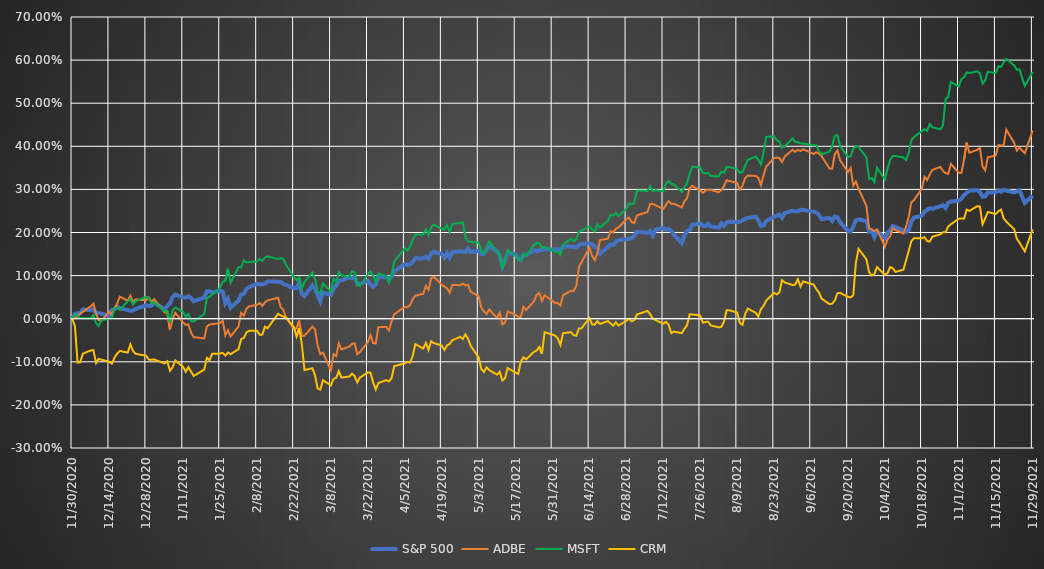
| Category | S&P 500 | ADBE | MSFT | CRM |
|---|---|---|---|---|
| 11/29/21 | 0.285 | 0.437 | 0.573 | 0.207 |
| 11/26/21 | 0.269 | 0.384 | 0.54 | 0.156 |
| 11/24/21 | 0.298 | 0.397 | 0.579 | 0.176 |
| 11/23/21 | 0.295 | 0.39 | 0.577 | 0.186 |
| 11/22/21 | 0.293 | 0.408 | 0.587 | 0.208 |
| 11/19/21 | 0.297 | 0.439 | 0.603 | 0.225 |
| 11/18/21 | 0.299 | 0.402 | 0.594 | 0.233 |
| 11/17/21 | 0.295 | 0.402 | 0.584 | 0.253 |
| 11/16/21 | 0.298 | 0.402 | 0.586 | 0.249 |
| 11/15/21 | 0.293 | 0.379 | 0.57 | 0.243 |
| 11/12/21 | 0.293 | 0.374 | 0.573 | 0.248 |
| 11/11/21 | 0.284 | 0.344 | 0.553 | 0.233 |
| 11/10/21 | 0.283 | 0.353 | 0.545 | 0.219 |
| 11/9/21 | 0.294 | 0.396 | 0.569 | 0.26 |
| 11/8/21 | 0.298 | 0.392 | 0.574 | 0.261 |
| 11/5/21 | 0.297 | 0.385 | 0.57 | 0.25 |
| 11/4/21 | 0.292 | 0.409 | 0.572 | 0.253 |
| 11/3/21 | 0.287 | 0.369 | 0.56 | 0.232 |
| 11/2/21 | 0.279 | 0.338 | 0.556 | 0.233 |
| 11/1/21 | 0.274 | 0.338 | 0.539 | 0.232 |
| 10/29/21 | 0.272 | 0.359 | 0.549 | 0.219 |
| 10/28/21 | 0.269 | 0.336 | 0.515 | 0.214 |
| 10/27/21 | 0.257 | 0.338 | 0.51 | 0.201 |
| 10/26/21 | 0.263 | 0.343 | 0.449 | 0.201 |
| 10/25/21 | 0.261 | 0.352 | 0.439 | 0.196 |
| 10/22/21 | 0.255 | 0.345 | 0.444 | 0.19 |
| 10/21/21 | 0.256 | 0.335 | 0.452 | 0.179 |
| 10/20/21 | 0.253 | 0.322 | 0.436 | 0.18 |
| 10/19/21 | 0.248 | 0.329 | 0.44 | 0.189 |
| 10/18/21 | 0.239 | 0.302 | 0.435 | 0.187 |
| 10/15/21 | 0.235 | 0.275 | 0.421 | 0.187 |
| 10/14/21 | 0.225 | 0.27 | 0.414 | 0.18 |
| 10/13/21 | 0.205 | 0.235 | 0.384 | 0.157 |
| 10/12/21 | 0.201 | 0.214 | 0.368 | 0.135 |
| 10/11/21 | 0.204 | 0.198 | 0.374 | 0.114 |
| 10/8/21 | 0.213 | 0.206 | 0.377 | 0.109 |
| 10/7/21 | 0.215 | 0.21 | 0.377 | 0.117 |
| 10/6/21 | 0.205 | 0.192 | 0.369 | 0.12 |
| 10/5/21 | 0.2 | 0.184 | 0.349 | 0.106 |
| 10/4/21 | 0.187 | 0.167 | 0.323 | 0.102 |
| 10/1/21 | 0.203 | 0.207 | 0.35 | 0.12 |
| 9/30/21 | 0.189 | 0.203 | 0.317 | 0.103 |
| 9/29/21 | 0.204 | 0.207 | 0.327 | 0.1 |
| 9/28/21 | 0.202 | 0.21 | 0.324 | 0.108 |
| 9/27/21 | 0.227 | 0.262 | 0.374 | 0.138 |
| 9/24/21 | 0.23 | 0.301 | 0.398 | 0.162 |
| 9/23/21 | 0.228 | 0.318 | 0.399 | 0.13 |
| 9/22/21 | 0.214 | 0.309 | 0.395 | 0.054 |
| 9/21/21 | 0.202 | 0.35 | 0.377 | 0.05 |
| 9/20/21 | 0.203 | 0.34 | 0.375 | 0.051 |
| 9/17/21 | 0.224 | 0.368 | 0.401 | 0.06 |
| 9/16/21 | 0.235 | 0.39 | 0.426 | 0.059 |
| 9/15/21 | 0.237 | 0.382 | 0.424 | 0.042 |
| 9/14/21 | 0.227 | 0.348 | 0.4 | 0.035 |
| 9/13/21 | 0.234 | 0.348 | 0.387 | 0.034 |
| 9/10/21 | 0.231 | 0.377 | 0.381 | 0.046 |
| 9/9/21 | 0.241 | 0.383 | 0.389 | 0.061 |
| 9/8/21 | 0.246 | 0.386 | 0.402 | 0.068 |
| 9/7/21 | 0.248 | 0.382 | 0.402 | 0.079 |
| 9/3/21 | 0.252 | 0.393 | 0.407 | 0.087 |
| 9/2/21 | 0.253 | 0.389 | 0.407 | 0.075 |
| 9/1/21 | 0.249 | 0.392 | 0.41 | 0.092 |
| 8/31/21 | 0.249 | 0.387 | 0.41 | 0.079 |
| 8/30/21 | 0.25 | 0.392 | 0.418 | 0.078 |
| 8/27/21 | 0.245 | 0.376 | 0.4 | 0.084 |
| 8/26/21 | 0.234 | 0.363 | 0.397 | 0.089 |
| 8/25/21 | 0.241 | 0.373 | 0.411 | 0.061 |
| 8/24/21 | 0.239 | 0.374 | 0.414 | 0.056 |
| 8/23/21 | 0.237 | 0.373 | 0.423 | 0.06 |
| 8/20/21 | 0.226 | 0.353 | 0.422 | 0.042 |
| 8/19/21 | 0.217 | 0.333 | 0.386 | 0.03 |
| 8/18/21 | 0.215 | 0.31 | 0.358 | 0.022 |
| 8/17/21 | 0.228 | 0.327 | 0.369 | 0.005 |
| 8/16/21 | 0.237 | 0.331 | 0.376 | 0.014 |
| 8/13/21 | 0.234 | 0.332 | 0.368 | 0.023 |
| 8/12/21 | 0.232 | 0.326 | 0.354 | 0.011 |
| 8/11/21 | 0.228 | 0.308 | 0.34 | -0.014 |
| 8/10/21 | 0.225 | 0.299 | 0.338 | -0.01 |
| 8/9/21 | 0.224 | 0.315 | 0.347 | 0.014 |
| 8/6/21 | 0.225 | 0.32 | 0.352 | 0.019 |
| 8/5/21 | 0.223 | 0.321 | 0.352 | 0.019 |
| 8/4/21 | 0.216 | 0.308 | 0.338 | -0.007 |
| 8/3/21 | 0.221 | 0.298 | 0.341 | -0.019 |
| 8/2/21 | 0.211 | 0.293 | 0.33 | -0.02 |
| 7/30/21 | 0.214 | 0.299 | 0.331 | -0.016 |
| 7/29/21 | 0.22 | 0.299 | 0.338 | -0.007 |
| 7/28/21 | 0.215 | 0.298 | 0.337 | -0.007 |
| 7/27/21 | 0.215 | 0.292 | 0.339 | -0.009 |
| 7/26/21 | 0.221 | 0.297 | 0.35 | 0.007 |
| 7/23/21 | 0.218 | 0.308 | 0.353 | 0.01 |
| 7/22/21 | 0.206 | 0.303 | 0.337 | 0.01 |
| 7/21/21 | 0.204 | 0.28 | 0.315 | -0.015 |
| 7/20/21 | 0.194 | 0.272 | 0.305 | -0.023 |
| 7/19/21 | 0.176 | 0.258 | 0.294 | -0.034 |
| 7/16/21 | 0.195 | 0.267 | 0.311 | -0.03 |
| 7/15/21 | 0.204 | 0.267 | 0.313 | -0.033 |
| 7/14/21 | 0.208 | 0.272 | 0.32 | -0.014 |
| 7/13/21 | 0.206 | 0.264 | 0.313 | -0.007 |
| 7/12/21 | 0.211 | 0.254 | 0.295 | -0.012 |
| 7/9/21 | 0.207 | 0.263 | 0.298 | -0.003 |
| 7/8/21 | 0.193 | 0.266 | 0.296 | 0 |
| 7/7/21 | 0.203 | 0.266 | 0.308 | 0.011 |
| 7/6/21 | 0.199 | 0.248 | 0.297 | 0.018 |
| 7/2/21 | 0.202 | 0.24 | 0.297 | 0.01 |
| 7/1/21 | 0.193 | 0.222 | 0.269 | -0.003 |
| 6/30/21 | 0.187 | 0.224 | 0.265 | -0.006 |
| 6/29/21 | 0.185 | 0.235 | 0.268 | 0 |
| 6/28/21 | 0.185 | 0.231 | 0.255 | -0.005 |
| 6/25/21 | 0.182 | 0.211 | 0.238 | -0.016 |
| 6/24/21 | 0.178 | 0.209 | 0.246 | -0.008 |
| 6/23/21 | 0.171 | 0.2 | 0.239 | -0.016 |
| 6/22/21 | 0.173 | 0.203 | 0.24 | -0.011 |
| 6/21/21 | 0.167 | 0.186 | 0.227 | -0.005 |
| 6/18/21 | 0.15 | 0.182 | 0.212 | -0.012 |
| 6/17/21 | 0.166 | 0.152 | 0.219 | -0.006 |
| 6/16/21 | 0.166 | 0.136 | 0.202 | -0.014 |
| 6/15/21 | 0.173 | 0.146 | 0.207 | -0.013 |
| 6/14/21 | 0.175 | 0.164 | 0.214 | 0.002 |
| 6/11/21 | 0.173 | 0.131 | 0.205 | -0.022 |
| 6/10/21 | 0.171 | 0.119 | 0.202 | -0.023 |
| 6/9/21 | 0.165 | 0.076 | 0.185 | -0.04 |
| 6/8/21 | 0.167 | 0.064 | 0.18 | -0.038 |
| 6/7/21 | 0.167 | 0.065 | 0.186 | -0.031 |
| 6/4/21 | 0.168 | 0.054 | 0.172 | -0.034 |
| 6/3/21 | 0.158 | 0.031 | 0.148 | -0.061 |
| 6/2/21 | 0.162 | 0.036 | 0.155 | -0.045 |
| 6/1/21 | 0.16 | 0.036 | 0.156 | -0.039 |
| 5/28/21 | 0.161 | 0.055 | 0.166 | -0.031 |
| 5/27/21 | 0.16 | 0.041 | 0.165 | -0.081 |
| 5/26/21 | 0.159 | 0.06 | 0.175 | -0.066 |
| 5/25/21 | 0.156 | 0.056 | 0.176 | -0.074 |
| 5/24/21 | 0.159 | 0.04 | 0.171 | -0.077 |
| 5/21/21 | 0.148 | 0.02 | 0.145 | -0.094 |
| 5/20/21 | 0.148 | 0.028 | 0.151 | -0.09 |
| 5/19/21 | 0.136 | 0.004 | 0.136 | -0.1 |
| 5/18/21 | 0.14 | 0.004 | 0.136 | -0.128 |
| 5/17/21 | 0.15 | 0.009 | 0.145 | -0.125 |
| 5/14/21 | 0.152 | 0.017 | 0.159 | -0.114 |
| 5/13/21 | 0.136 | -0.009 | 0.135 | -0.138 |
| 5/12/21 | 0.122 | -0.013 | 0.116 | -0.143 |
| 5/11/21 | 0.146 | 0.014 | 0.15 | -0.123 |
| 5/10/21 | 0.157 | 0.002 | 0.155 | -0.13 |
| 5/7/21 | 0.169 | 0.021 | 0.179 | -0.119 |
| 5/6/21 | 0.16 | 0.011 | 0.167 | -0.113 |
| 5/5/21 | 0.151 | 0.017 | 0.151 | -0.124 |
| 5/4/21 | 0.15 | 0.026 | 0.158 | -0.116 |
| 5/3/21 | 0.158 | 0.052 | 0.177 | -0.09 |
| 4/30/21 | 0.154 | 0.062 | 0.178 | -0.063 |
| 4/29/21 | 0.163 | 0.079 | 0.18 | -0.047 |
| 4/28/21 | 0.155 | 0.077 | 0.189 | -0.036 |
| 4/27/21 | 0.156 | 0.081 | 0.224 | -0.047 |
| 4/26/21 | 0.156 | 0.078 | 0.222 | -0.042 |
| 4/23/21 | 0.154 | 0.078 | 0.22 | -0.05 |
| 4/22/21 | 0.142 | 0.06 | 0.201 | -0.059 |
| 4/21/21 | 0.152 | 0.071 | 0.217 | -0.062 |
| 4/20/21 | 0.142 | 0.075 | 0.206 | -0.073 |
| 4/19/21 | 0.15 | 0.079 | 0.209 | -0.062 |
| 4/16/21 | 0.156 | 0.097 | 0.218 | -0.057 |
| 4/15/21 | 0.152 | 0.094 | 0.212 | -0.052 |
| 4/14/21 | 0.139 | 0.067 | 0.194 | -0.072 |
| 4/13/21 | 0.144 | 0.076 | 0.208 | -0.056 |
| 4/12/21 | 0.14 | 0.058 | 0.195 | -0.069 |
| 4/9/21 | 0.14 | 0.053 | 0.195 | -0.059 |
| 4/8/21 | 0.131 | 0.045 | 0.183 | -0.087 |
| 4/7/21 | 0.127 | 0.031 | 0.167 | -0.102 |
| 4/6/21 | 0.125 | 0.027 | 0.158 | -0.101 |
| 4/5/21 | 0.126 | 0.027 | 0.163 | -0.104 |
| 4/1/21 | 0.11 | 0.01 | 0.132 | -0.11 |
| 3/31/21 | 0.097 | -0.006 | 0.101 | -0.138 |
| 3/30/21 | 0.093 | -0.027 | 0.083 | -0.146 |
| 3/29/21 | 0.096 | -0.019 | 0.099 | -0.143 |
| 3/26/21 | 0.097 | -0.02 | 0.105 | -0.149 |
| 3/25/21 | 0.079 | -0.057 | 0.085 | -0.164 |
| 3/24/21 | 0.074 | -0.056 | 0.1 | -0.148 |
| 3/23/21 | 0.08 | -0.038 | 0.11 | -0.125 |
| 3/22/21 | 0.088 | -0.054 | 0.102 | -0.125 |
| 3/19/21 | 0.08 | -0.077 | 0.076 | -0.137 |
| 3/18/21 | 0.081 | -0.082 | 0.078 | -0.148 |
| 3/17/21 | 0.097 | -0.057 | 0.107 | -0.133 |
| 3/16/21 | 0.094 | -0.058 | 0.11 | -0.127 |
| 3/15/21 | 0.096 | -0.065 | 0.097 | -0.134 |
| 3/12/21 | 0.089 | -0.071 | 0.101 | -0.137 |
| 3/11/21 | 0.088 | -0.057 | 0.108 | -0.121 |
| 3/10/21 | 0.077 | -0.087 | 0.086 | -0.138 |
| 3/9/21 | 0.07 | -0.082 | 0.092 | -0.139 |
| 3/8/21 | 0.055 | -0.12 | 0.062 | -0.155 |
| 3/5/21 | 0.061 | -0.079 | 0.082 | -0.143 |
| 3/4/21 | 0.041 | -0.082 | 0.059 | -0.165 |
| 3/3/21 | 0.055 | -0.063 | 0.063 | -0.162 |
| 3/2/21 | 0.069 | -0.025 | 0.092 | -0.132 |
| 3/1/21 | 0.077 | -0.019 | 0.107 | -0.115 |
| 2/26/21 | 0.052 | -0.039 | 0.086 | -0.119 |
| 2/25/21 | 0.057 | -0.04 | 0.07 | -0.06 |
| 2/24/21 | 0.084 | -0.004 | 0.096 | -0.022 |
| 2/23/21 | 0.072 | -0.022 | 0.09 | -0.041 |
| 2/22/21 | 0.07 | -0.023 | 0.095 | -0.02 |
| 2/19/21 | 0.079 | 0.001 | 0.126 | 0.003 |
| 2/18/21 | 0.081 | 0.021 | 0.139 | 0.005 |
| 2/17/21 | 0.086 | 0.027 | 0.141 | 0.008 |
| 2/16/21 | 0.086 | 0.048 | 0.138 | 0.011 |
| 2/12/21 | 0.086 | 0.043 | 0.144 | -0.022 |
| 2/11/21 | 0.081 | 0.038 | 0.142 | -0.019 |
| 2/10/21 | 0.08 | 0.03 | 0.134 | -0.037 |
| 2/9/21 | 0.08 | 0.037 | 0.139 | -0.037 |
| 2/8/21 | 0.081 | 0.032 | 0.133 | -0.028 |
| 2/5/21 | 0.073 | 0.029 | 0.131 | -0.028 |
| 2/4/21 | 0.069 | 0.023 | 0.131 | -0.032 |
| 2/3/21 | 0.058 | 0.007 | 0.135 | -0.045 |
| 2/2/21 | 0.057 | 0.014 | 0.119 | -0.047 |
| 2/1/21 | 0.042 | -0.018 | 0.119 | -0.071 |
| 1/29/21 | 0.026 | -0.041 | 0.084 | -0.082 |
| 1/28/21 | 0.046 | -0.027 | 0.116 | -0.079 |
| 1/27/21 | 0.036 | -0.039 | 0.088 | -0.086 |
| 1/26/21 | 0.063 | -0.005 | 0.085 | -0.079 |
| 1/25/21 | 0.065 | -0.011 | 0.072 | -0.081 |
| 1/22/21 | 0.061 | -0.013 | 0.055 | -0.081 |
| 1/21/21 | 0.064 | -0.013 | 0.051 | -0.096 |
| 1/20/21 | 0.064 | -0.018 | 0.048 | -0.091 |
| 1/19/21 | 0.049 | -0.046 | 0.011 | -0.118 |
| 1/15/21 | 0.04 | -0.043 | -0.007 | -0.133 |
| 1/14/21 | 0.048 | -0.032 | -0.005 | -0.123 |
| 1/13/21 | 0.052 | -0.013 | 0.011 | -0.112 |
| 1/12/21 | 0.05 | -0.014 | 0.004 | -0.123 |
| 1/11/21 | 0.049 | -0.009 | 0.016 | -0.112 |
| 1/8/21 | 0.056 | 0.014 | 0.026 | -0.097 |
| 1/7/21 | 0.05 | -0.002 | 0.02 | -0.113 |
| 1/6/21 | 0.035 | -0.025 | -0.009 | -0.121 |
| 1/5/21 | 0.029 | 0.015 | 0.018 | -0.099 |
| 1/4/21 | 0.022 | 0.014 | 0.017 | -0.104 |
| 12/31/20 | 0.037 | 0.045 | 0.039 | -0.095 |
| 12/30/20 | 0.03 | 0.04 | 0.036 | -0.095 |
| 12/29/20 | 0.029 | 0.049 | 0.047 | -0.095 |
| 12/28/20 | 0.031 | 0.043 | 0.051 | -0.086 |
| 12/24/20 | 0.022 | 0.045 | 0.041 | -0.081 |
| 12/23/20 | 0.019 | 0.039 | 0.032 | -0.075 |
| 12/22/20 | 0.018 | 0.054 | 0.046 | -0.06 |
| 12/21/20 | 0.02 | 0.042 | 0.04 | -0.079 |
| 12/18/20 | 0.024 | 0.051 | 0.021 | -0.075 |
| 12/17/20 | 0.028 | 0.035 | 0.025 | -0.081 |
| 12/16/20 | 0.022 | 0.024 | 0.024 | -0.09 |
| 12/15/20 | 0.02 | 0.009 | 0 | -0.104 |
| 12/14/20 | 0.007 | 0.017 | 0.001 | -0.1 |
| 12/11/20 | 0.012 | -0.005 | -0.004 | -0.095 |
| 12/10/20 | 0.013 | -0.003 | -0.017 | -0.093 |
| 12/9/20 | 0.014 | 0.011 | -0.011 | -0.103 |
| 12/8/20 | 0.022 | 0.035 | 0.009 | -0.073 |
| 12/7/20 | 0.019 | 0.029 | 0.001 | -0.074 |
| 12/4/20 | 0.021 | 0.016 | 0.001 | -0.081 |
| 12/3/20 | 0.012 | 0.012 | 0.001 | -0.101 |
| 12/2/20 | 0.013 | 0.006 | 0.006 | -0.102 |
| 12/1/20 | 0.011 | 0.001 | 0.01 | -0.018 |
| 11/30/20 | 0 | 0 | 0 | 0 |